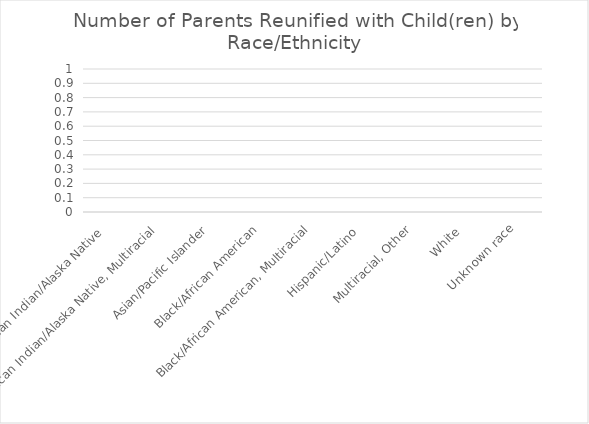
| Category | Reunified |
|---|---|
| American Indian/Alaska Native  | 0 |
| American Indian/Alaska Native, Multiracial | 0 |
| Asian/Pacific Islander | 0 |
| Black/African American | 0 |
| Black/African American, Multiracial | 0 |
| Hispanic/Latino  | 0 |
| Multiracial, Other | 0 |
| White  | 0 |
| Unknown race | 0 |